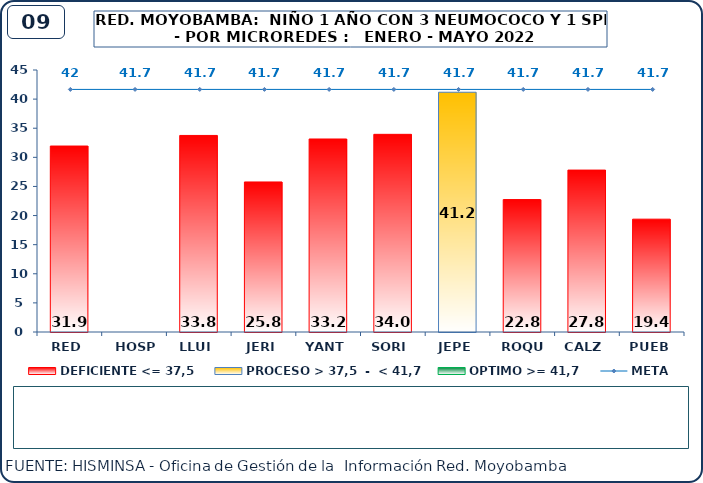
| Category | DEFICIENTE <= 37,5 | PROCESO > 37,5  -  < 41,7 | OPTIMO >= 41,7 |
|---|---|---|---|
| RED | 31.94 | 0 | 0 |
| HOSP | 0 | 0 | 0 |
| LLUI | 33.76 | 0 | 0 |
| JERI | 25.77 | 0 | 0 |
| YANT | 33.15 | 0 | 0 |
| SORI | 33.95 | 0 | 0 |
| JEPE | 0 | 41.18 | 0 |
| ROQU | 22.75 | 0 | 0 |
| CALZ | 27.81 | 0 | 0 |
| PUEB | 19.38 | 0 | 0 |